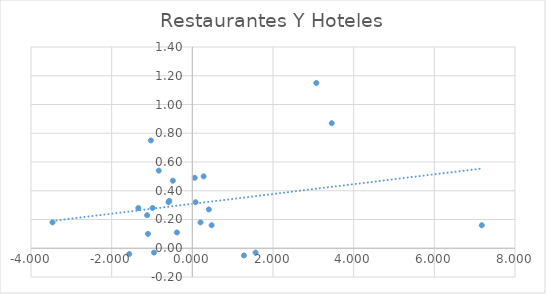
| Category | Restaurantes Y Hoteles |
|---|---|
| 0.06052582200249956 | 0.49 |
| -1.339539147515001 | 0.28 |
| -1.1203229332582998 | 0.23 |
| -0.9862037445886013 | 0.28 |
| -3.4662710747771994 | 0.18 |
| 0.4103518494638997 | 0.27 |
| -1.5653149541481977 | -0.04 |
| 1.5673496706761991 | -0.03 |
| 7.1770364527009995 | 0.16 |
| 0.47884246635880034 | 0.16 |
| -0.832734952533401 | 0.54 |
| 3.4562493478376117 | 0.87 |
| 0.28079979651694786 | 0.5 |
| -0.5906758229193689 | 0.32 |
| -0.38208630553888956 | 0.11 |
| -0.5726169698249004 | 0.33 |
| 0.08025158798270066 | 0.32 |
| 1.2789830493301095 | -0.05 |
| -1.1005497828799102 | 0.1 |
| 0.20330044603610042 | 0.18 |
| -0.48222478231940147 | 0.47 |
| -0.9518304220709997 | -0.03 |
| -1.027059621055 | 0.75 |
| 3.074367518631871 | 1.15 |